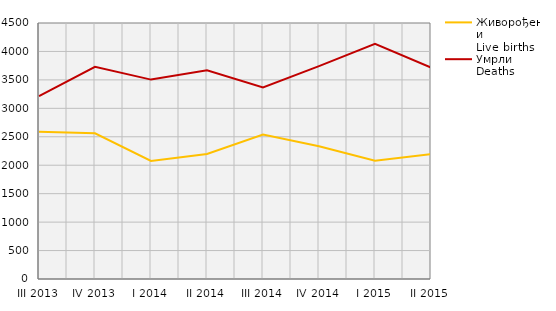
| Category | Живорођени
Live births | Умрли
Deaths |
|---|---|---|
| III 2013 | 2587 | 3214 |
| IV 2013 | 2561 | 3730 |
| I 2014 | 2076 | 3505 |
| II 2014 | 2197 | 3669 |
| III 2014 | 2540 | 3367 |
| IV 2014 | 2332 | 3743 |
| I 2015 | 2078 | 4132 |
| II 2015 | 2194 | 3716 |